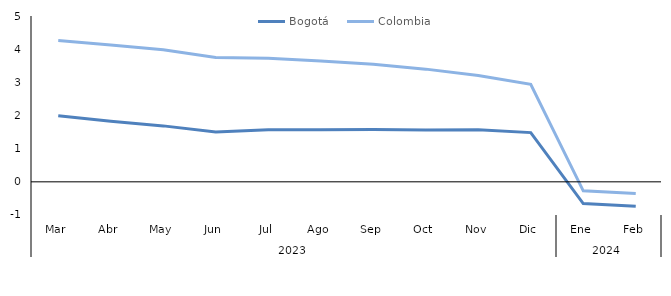
| Category | Bogotá | Colombia |
|---|---|---|
| 0 | 1.995 | 4.259 |
| 1 | 1.826 | 4.129 |
| 2 | 1.687 | 3.982 |
| 3 | 1.503 | 3.752 |
| 4 | 1.569 | 3.723 |
| 5 | 1.57 | 3.642 |
| 6 | 1.578 | 3.543 |
| 7 | 1.56 | 3.398 |
| 8 | 1.573 | 3.209 |
| 9 | 1.484 | 2.941 |
| 10 | -0.657 | -0.271 |
| 11 | -0.733 | -0.35 |